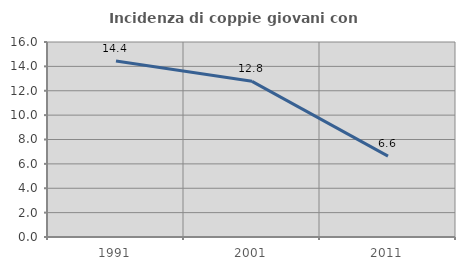
| Category | Incidenza di coppie giovani con figli |
|---|---|
| 1991.0 | 14.439 |
| 2001.0 | 12.772 |
| 2011.0 | 6.638 |